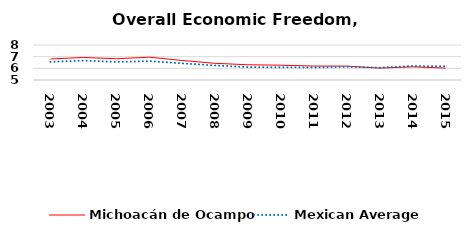
| Category | Michoacán de Ocampo | Mexican Average  |
|---|---|---|
| 2003.0 | 6.8 | 6.552 |
| 2004.0 | 6.931 | 6.668 |
| 2005.0 | 6.823 | 6.546 |
| 2006.0 | 6.955 | 6.619 |
| 2007.0 | 6.674 | 6.428 |
| 2008.0 | 6.431 | 6.248 |
| 2009.0 | 6.305 | 6.106 |
| 2010.0 | 6.268 | 6.086 |
| 2011.0 | 6.197 | 6.074 |
| 2012.0 | 6.19 | 6.134 |
| 2013.0 | 6.021 | 6.054 |
| 2014.0 | 6.13 | 6.2 |
| 2015.0 | 6.021 | 6.174 |